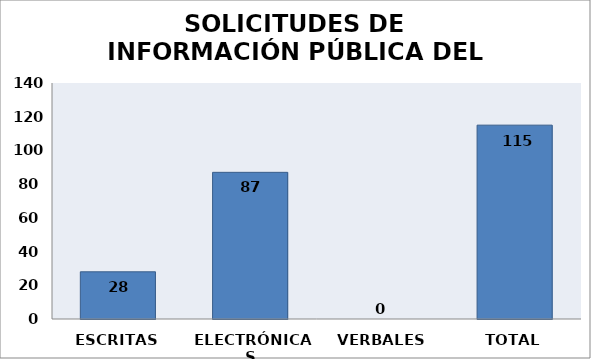
| Category | Series 0 |
|---|---|
| ESCRITAS | 28 |
| ELECTRÓNICAS | 87 |
| VERBALES | 0 |
| TOTAL | 115 |